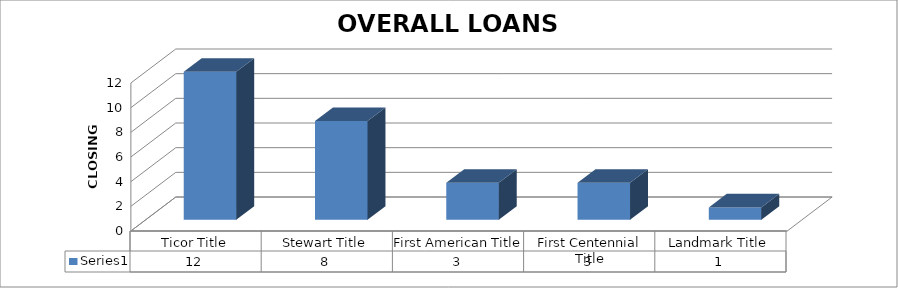
| Category | Series 0 |
|---|---|
| Ticor Title | 12 |
| Stewart Title | 8 |
| First American Title | 3 |
| First Centennial Title | 3 |
| Landmark Title | 1 |